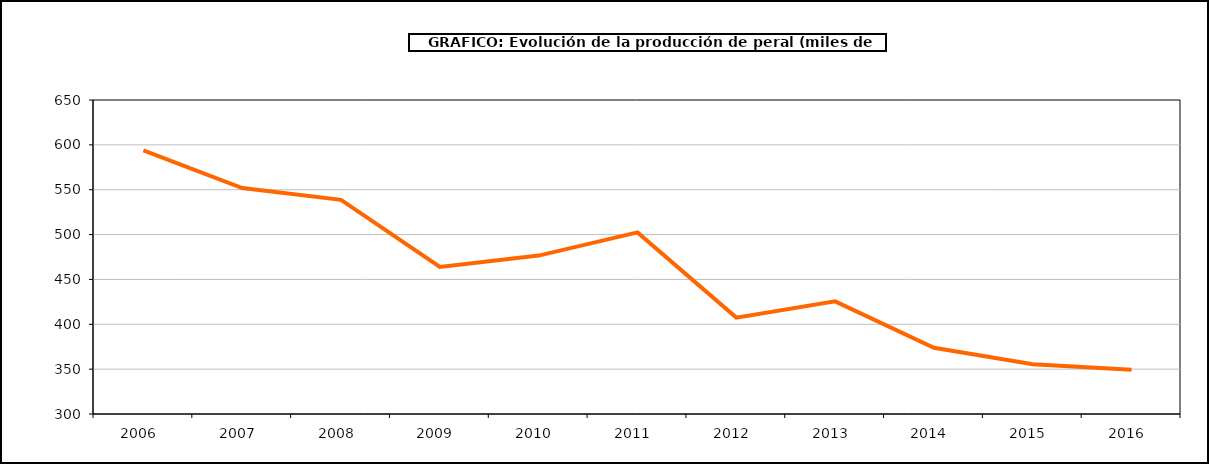
| Category | producción peral |
|---|---|
| 2006.0 | 593.858 |
| 2007.0 | 551.848 |
| 2008.0 | 538.675 |
| 2009.0 | 463.969 |
| 2010.0 | 476.586 |
| 2011.0 | 502.434 |
| 2012.0 | 407.428 |
| 2013.0 | 425.56 |
| 2014.0 | 373.865 |
| 2015.0 | 355.41 |
| 2016.0 | 349.247 |